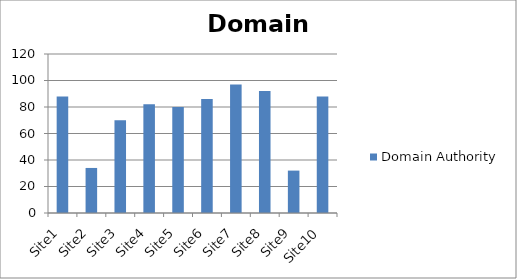
| Category | Domain Authority |
|---|---|
| Site1 | 88 |
| Site2 | 34 |
| Site3 | 70 |
| Site4 | 82 |
| Site5 | 80 |
| Site6 | 86 |
| Site7 | 97 |
| Site8 | 92 |
| Site9 | 32 |
| Site10 | 88 |